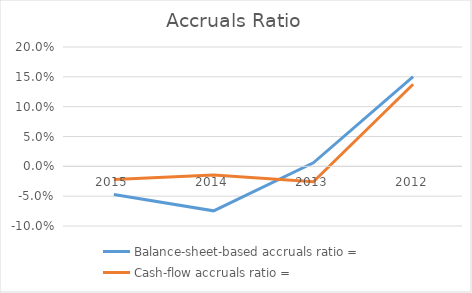
| Category | Balance-sheet-based accruals ratio =  | Cash-flow accruals ratio = |
|---|---|---|
| 2015.0 | -0.047 | -0.022 |
| 2014.0 | -0.075 | -0.015 |
| 2013.0 | 0.006 | -0.026 |
| 2012.0 | 0.15 | 0.138 |